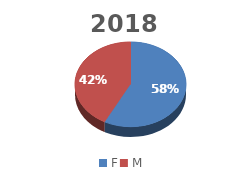
| Category | Series 1 | Series 0 |
|---|---|---|
| F | 2424 | 2424 |
| M | 1781 | 1781 |